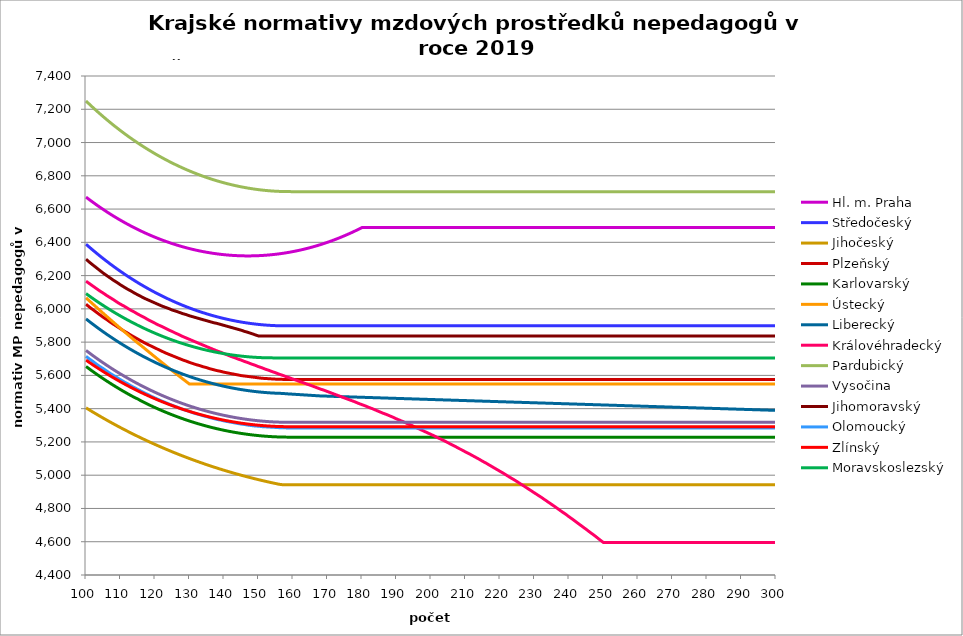
| Category | Hl. m. Praha | Středočeský | Jihočeský | Plzeňský | Karlovarský  | Ústecký   | Liberecký | Královéhradecký | Pardubický | Vysočina | Jihomoravský | Olomoucký | Zlínský | Moravskoslezský |
|---|---|---|---|---|---|---|---|---|---|---|---|---|---|---|
| 100.0 | 6671.932 | 6388.676 | 5404.99 | 6027.965 | 5653.637 | 6066.515 | 5939.588 | 6166.524 | 7249.706 | 5749.935 | 6298.651 | 5714.683 | 5691.974 | 6091.869 |
| 101.0 | 6656.235 | 6370.554 | 5392.238 | 6010.844 | 5638.253 | 6047.606 | 5923.342 | 6151.72 | 7229.979 | 5734.349 | 6280.38 | 5698.536 | 5677.551 | 6076.849 |
| 102.0 | 6640.947 | 6352.846 | 5379.684 | 5995.364 | 5623.214 | 6028.814 | 5907.46 | 6136.988 | 7210.694 | 5718.994 | 6263.861 | 5683.935 | 5663.445 | 6062.179 |
| 103.0 | 6626.064 | 6335.548 | 5367.325 | 5979.964 | 5608.513 | 6010.138 | 5891.937 | 6122.325 | 7191.844 | 5704.014 | 6247.429 | 5667.961 | 5649.653 | 6047.856 |
| 104.0 | 6611.579 | 6318.652 | 5355.159 | 5964.643 | 5594.148 | 5991.578 | 5876.768 | 6107.733 | 7173.422 | 5689.403 | 6231.083 | 5653.517 | 5636.169 | 6033.875 |
| 105.0 | 6597.49 | 6302.154 | 5343.183 | 5949.399 | 5580.112 | 5973.132 | 5861.947 | 6094.82 | 7155.424 | 5675.158 | 6214.823 | 5640.58 | 5622.991 | 6020.232 |
| 106.0 | 6583.789 | 6286.048 | 5331.395 | 5935.747 | 5566.402 | 5954.799 | 5847.471 | 6080.359 | 7137.843 | 5661.272 | 6200.26 | 5626.274 | 5610.114 | 6006.922 |
| 107.0 | 6570.475 | 6270.329 | 5319.793 | 5920.651 | 5553.013 | 5936.579 | 5833.334 | 6067.561 | 7120.675 | 5647.597 | 6185.766 | 5612.041 | 5597.535 | 5993.942 |
| 108.0 | 6557.541 | 6254.99 | 5308.376 | 5907.13 | 5539.941 | 5918.469 | 5819.533 | 6054.818 | 7103.913 | 5634.274 | 6171.34 | 5599.293 | 5585.25 | 5981.288 |
| 109.0 | 6544.984 | 6240.029 | 5297.14 | 5893.671 | 5527.183 | 5900.47 | 5806.062 | 6040.545 | 7087.553 | 5621.299 | 6158.573 | 5586.603 | 5573.255 | 5968.956 |
| 110.0 | 6532.799 | 6225.438 | 5286.085 | 5880.273 | 5514.734 | 5882.58 | 5792.918 | 6027.914 | 7071.589 | 5608.666 | 6144.272 | 5573.97 | 5561.548 | 5956.942 |
| 111.0 | 6520.984 | 6211.215 | 5275.208 | 5866.935 | 5502.59 | 5864.798 | 5780.097 | 6016.906 | 7056.017 | 5596.372 | 6131.617 | 5561.394 | 5550.124 | 5945.242 |
| 112.0 | 6509.534 | 6197.354 | 5264.507 | 5855.131 | 5490.748 | 5847.123 | 5767.596 | 6004.374 | 7040.832 | 5584.272 | 6119.013 | 5550.263 | 5538.981 | 5933.854 |
| 113.0 | 6498.445 | 6183.851 | 5253.98 | 5841.907 | 5479.205 | 5829.555 | 5755.409 | 5991.894 | 7026.03 | 5572.504 | 6108.028 | 5537.793 | 5528.116 | 5922.774 |
| 114.0 | 6487.714 | 6170.701 | 5243.625 | 5830.203 | 5467.956 | 5812.092 | 5743.534 | 5981.017 | 7011.605 | 5561.064 | 6095.521 | 5526.756 | 5517.525 | 5911.999 |
| 115.0 | 6477.338 | 6157.9 | 5233.442 | 5818.545 | 5458.362 | 5794.733 | 5731.966 | 5968.634 | 6997.555 | 5549.948 | 6084.619 | 5515.763 | 5507.206 | 5901.526 |
| 116.0 | 6467.313 | 6145.446 | 5223.427 | 5806.934 | 5446.33 | 5779.041 | 5720.704 | 5957.84 | 6983.874 | 5539.152 | 6073.757 | 5504.814 | 5497.156 | 5891.352 |
| 117.0 | 6457.637 | 6133.332 | 5213.579 | 5795.37 | 5435.946 | 5761.879 | 5709.742 | 5947.086 | 6970.559 | 5528.536 | 6062.933 | 5493.908 | 5487.371 | 5881.473 |
| 118.0 | 6448.306 | 6121.557 | 5203.897 | 5785.288 | 5425.844 | 5744.818 | 5699.079 | 5934.843 | 6957.605 | 5518.235 | 6053.686 | 5484.4 | 5477.851 | 5871.887 |
| 119.0 | 6439.318 | 6110.116 | 5194.379 | 5775.242 | 5416.022 | 5727.858 | 5688.71 | 5924.172 | 6945.01 | 5508.246 | 6044.467 | 5473.575 | 5468.591 | 5862.592 |
| 120.0 | 6430.669 | 6099.005 | 5185.024 | 5765.23 | 5406.476 | 5710.998 | 5678.634 | 5913.538 | 6932.769 | 5498.564 | 6035.276 | 5464.138 | 5459.589 | 5853.584 |
| 121.0 | 6422.357 | 6088.222 | 5175.829 | 5755.253 | 5397.204 | 5694.237 | 5668.846 | 5902.943 | 6920.879 | 5489.188 | 6026.113 | 5454.733 | 5450.844 | 5844.862 |
| 122.0 | 6414.38 | 6077.763 | 5166.793 | 5745.311 | 5388.202 | 5677.574 | 5659.345 | 5893.892 | 6909.337 | 5479.979 | 6016.978 | 5445.361 | 5442.352 | 5836.422 |
| 123.0 | 6406.735 | 6067.625 | 5157.915 | 5735.403 | 5379.469 | 5661.008 | 5650.127 | 5883.367 | 6898.138 | 5471.071 | 6009.387 | 5437.353 | 5434.112 | 5828.263 |
| 124.0 | 6399.42 | 6057.805 | 5149.193 | 5726.937 | 5371.002 | 5644.538 | 5641.19 | 5872.88 | 6887.281 | 5462.46 | 6001.815 | 5428.04 | 5426.121 | 5820.382 |
| 125.0 | 6392.432 | 6048.3 | 5140.626 | 5718.497 | 5362.799 | 5628.165 | 5632.532 | 5863.921 | 6876.762 | 5454.144 | 5992.753 | 5420.083 | 5418.378 | 5812.777 |
| 126.0 | 6385.771 | 6039.107 | 5132.212 | 5710.081 | 5354.857 | 5611.885 | 5624.15 | 5853.503 | 6866.578 | 5446.12 | 5986.727 | 5412.149 | 5410.879 | 5805.447 |
| 127.0 | 6379.432 | 6030.223 | 5123.951 | 5701.69 | 5347.175 | 5595.7 | 5616.041 | 5844.602 | 6856.727 | 5438.253 | 5979.212 | 5404.239 | 5403.624 | 5798.388 |
| 128.0 | 6373.416 | 6021.647 | 5115.84 | 5693.324 | 5339.749 | 5579.608 | 5608.203 | 5834.252 | 6847.204 | 5430.674 | 5971.715 | 5396.351 | 5396.611 | 5791.599 |
| 129.0 | 6367.719 | 6013.375 | 5107.878 | 5686.37 | 5332.578 | 5563.608 | 5600.635 | 5825.41 | 6838.009 | 5423.381 | 5965.731 | 5389.796 | 5389.837 | 5785.078 |
| 130.0 | 6362.34 | 6005.404 | 5100.065 | 5678.049 | 5325.66 | 5547.7 | 5593.334 | 5816.595 | 6829.138 | 5416.372 | 5958.269 | 5383.256 | 5383.3 | 5778.824 |
| 131.0 | 6357.278 | 5997.734 | 5092.399 | 5671.133 | 5318.993 | 5547.7 | 5586.298 | 5807.807 | 6820.59 | 5409.644 | 5952.312 | 5375.43 | 5377 | 5772.835 |
| 132.0 | 6352.532 | 5990.361 | 5084.878 | 5664.234 | 5312.576 | 5547.7 | 5579.525 | 5799.045 | 6812.361 | 5403.065 | 5946.367 | 5368.925 | 5370.935 | 5767.108 |
| 133.0 | 6348.099 | 5983.283 | 5077.502 | 5658.726 | 5306.406 | 5547.7 | 5573.013 | 5790.309 | 6804.449 | 5396.764 | 5940.434 | 5363.733 | 5365.102 | 5761.644 |
| 134.0 | 6343.978 | 5976.499 | 5070.269 | 5651.857 | 5300.482 | 5547.7 | 5566.761 | 5781.599 | 6796.852 | 5390.739 | 5934.513 | 5357.257 | 5359.501 | 5756.439 |
| 135.0 | 6340.169 | 5970.005 | 5063.179 | 5646.374 | 5294.802 | 5547.7 | 5560.767 | 5772.916 | 6789.569 | 5384.988 | 5928.603 | 5352.087 | 5354.131 | 5751.494 |
| 136.0 | 6336.67 | 5963.802 | 5056.229 | 5639.535 | 5289.365 | 5547.7 | 5555.029 | 5764.259 | 6782.597 | 5379.511 | 5922.706 | 5345.639 | 5348.989 | 5746.806 |
| 137.0 | 6333.48 | 5957.886 | 5049.42 | 5634.076 | 5284.169 | 5547.7 | 5549.546 | 5755.628 | 6775.934 | 5374.174 | 5916.82 | 5340.491 | 5344.075 | 5742.374 |
| 138.0 | 6330.598 | 5952.256 | 5042.749 | 5628.627 | 5279.213 | 5547.7 | 5544.316 | 5747.022 | 6769.579 | 5369.108 | 5912.413 | 5335.354 | 5339.387 | 5738.197 |
| 139.0 | 6328.023 | 5946.911 | 5036.217 | 5624.547 | 5274.496 | 5547.7 | 5539.337 | 5739.871 | 6763.53 | 5364.31 | 5906.548 | 5331.507 | 5334.924 | 5734.275 |
| 140.0 | 6325.756 | 5941.849 | 5029.821 | 5619.117 | 5270.016 | 5547.7 | 5534.609 | 5731.312 | 6757.785 | 5359.78 | 5900.694 | 5326.387 | 5330.685 | 5730.605 |
| 141.0 | 6323.794 | 5937.068 | 5023.561 | 5615.051 | 5265.772 | 5547.7 | 5530.131 | 5722.779 | 6752.343 | 5355.515 | 5894.851 | 5322.553 | 5326.669 | 5727.187 |
| 142.0 | 6322.137 | 5932.567 | 5017.437 | 5610.991 | 5261.763 | 5547.7 | 5525.9 | 5714.272 | 6747.203 | 5351.387 | 5889.021 | 5318.725 | 5322.875 | 5724.021 |
| 143.0 | 6320.785 | 5928.346 | 5011.446 | 5606.936 | 5257.988 | 5547.7 | 5521.917 | 5707.201 | 6742.362 | 5347.521 | 5883.202 | 5314.902 | 5319.302 | 5721.104 |
| 144.0 | 6319.738 | 5924.402 | 5005.589 | 5602.888 | 5254.446 | 5547.7 | 5518.179 | 5698.74 | 6737.82 | 5343.919 | 5877.394 | 5311.085 | 5315.95 | 5718.438 |
| 145.0 | 6318.995 | 5920.735 | 4999.864 | 5598.846 | 5251.136 | 5547.7 | 5514.686 | 5691.708 | 6733.576 | 5340.578 | 5871.598 | 5307.273 | 5312.816 | 5716.02 |
| 146.0 | 6318.557 | 5917.344 | 4994.27 | 5596.154 | 5248.057 | 5547.7 | 5511.437 | 5683.292 | 6729.628 | 5337.498 | 5864.368 | 5304.735 | 5309.902 | 5713.85 |
| 147.0 | 6318.422 | 5914.227 | 4988.807 | 5593.465 | 5245.209 | 5547.7 | 5508.431 | 5676.298 | 6725.975 | 5334.55 | 5858.598 | 5300.932 | 5307.205 | 5711.928 |
| 148.0 | 6318.59 | 5911.384 | 4983.473 | 5590.778 | 5242.59 | 5547.7 | 5505.667 | 5667.928 | 6722.617 | 5331.861 | 5851.4 | 5298.4 | 5304.725 | 5710.253 |
| 149.0 | 6319.063 | 5908.815 | 4978.269 | 5588.094 | 5240.2 | 5547.7 | 5503.145 | 5660.972 | 6719.552 | 5329.43 | 5844.221 | 5295.87 | 5302.462 | 5708.825 |
| 150.0 | 6319.84 | 5906.517 | 4973.193 | 5585.413 | 5238.038 | 5547.7 | 5500.864 | 5652.647 | 6716.78 | 5327.257 | 5837.059 | 5294.606 | 5300.415 | 5707.643 |
| 151.0 | 6320.921 | 5904.492 | 4968.244 | 5582.734 | 5236.104 | 5547.7 | 5498.823 | 5645.728 | 6714.3 | 5325.342 | 5837.059 | 5292.08 | 5298.584 | 5706.707 |
| 152.0 | 6322.306 | 5902.737 | 4963.422 | 5581.395 | 5234.397 | 5547.7 | 5497.022 | 5637.448 | 6712.112 | 5323.555 | 5837.059 | 5290.818 | 5296.968 | 5706.017 |
| 153.0 | 6323.997 | 5901.254 | 4958.726 | 5580.058 | 5232.918 | 5547.7 | 5495.461 | 5630.566 | 6710.214 | 5322.024 | 5837.059 | 5289.557 | 5295.566 | 5705.573 |
| 154.0 | 6325.992 | 5900.04 | 4954.155 | 5578.72 | 5231.664 | 5547.7 | 5494.138 | 5622.331 | 6708.606 | 5320.749 | 5837.059 | 5288.296 | 5294.379 | 5705.374 |
| 155.0 | 6328.294 | 5899.097 | 4949.709 | 5577.384 | 5230.637 | 5547.7 | 5493.054 | 5615.486 | 6707.289 | 5319.73 | 5837.059 | 5287.035 | 5293.406 | 5704.821 |
| 156.0 | 6330.903 | 5898.423 | 4945.387 | 5577.384 | 5229.835 | 5547.7 | 5492.208 | 5607.294 | 6706.261 | 5318.966 | 5837.059 | 5285.776 | 5292.646 | 5704.821 |
| 157.0 | 6333.819 | 5898.019 | 4942.671 | 5576.048 | 5229.259 | 5547.7 | 5491.6 | 5600.486 | 6705.522 | 5318.329 | 5837.059 | 5285.776 | 5292.101 | 5704.821 |
| 158.0 | 6337.043 | 5897.885 | 4942.671 | 5576.048 | 5228.908 | 5547.7 | 5489.619 | 5592.338 | 6705.073 | 5317.947 | 5837.059 | 5284.516 | 5291.769 | 5704.821 |
| 159.0 | 6340.577 | 5898.019 | 4942.671 | 5576.048 | 5228.783 | 5547.7 | 5488.299 | 5585.566 | 6704.912 | 5317.819 | 5837.059 | 5284.516 | 5291.65 | 5704.821 |
| 160.0 | 6344.421 | 5897.885 | 4942.671 | 5576.048 | 5228.883 | 5547.7 | 5486.98 | 5577.461 | 6704.72 | 5317.692 | 5837.059 | 5284.516 | 5291.65 | 5704.821 |
| 161.0 | 6348.576 | 5897.885 | 4942.671 | 5576.048 | 5228.633 | 5547.7 | 5485.661 | 5570.725 | 6704.72 | 5317.692 | 5837.059 | 5284.516 | 5291.65 | 5704.821 |
| 162.0 | 6353.044 | 5897.885 | 4942.671 | 5576.048 | 5228.633 | 5547.7 | 5484.343 | 5562.663 | 6704.72 | 5317.692 | 5837.059 | 5284.516 | 5291.65 | 5704.821 |
| 163.0 | 6357.825 | 5897.885 | 4942.671 | 5576.048 | 5228.633 | 5547.7 | 5483.026 | 5555.962 | 6704.72 | 5317.692 | 5837.059 | 5284.516 | 5291.65 | 5704.821 |
| 164.0 | 6362.922 | 5897.885 | 4942.671 | 5576.048 | 5228.633 | 5547.7 | 5481.709 | 5547.943 | 6704.72 | 5317.692 | 5837.059 | 5284.516 | 5291.65 | 5704.821 |
| 165.0 | 6368.336 | 5897.885 | 4942.671 | 5576.048 | 5228.633 | 5547.7 | 5480.393 | 5541.278 | 6704.72 | 5317.692 | 5837.059 | 5284.516 | 5291.65 | 5704.821 |
| 166.0 | 6374.068 | 5897.885 | 4942.671 | 5576.048 | 5228.633 | 5547.7 | 5479.077 | 5533.301 | 6704.72 | 5317.692 | 5837.059 | 5284.516 | 5291.65 | 5704.821 |
| 167.0 | 6380.121 | 5897.885 | 4942.671 | 5576.048 | 5228.633 | 5547.7 | 5477.762 | 5525.347 | 6704.72 | 5317.692 | 5837.059 | 5284.516 | 5291.65 | 5704.821 |
| 168.0 | 6386.495 | 5897.885 | 4942.671 | 5576.048 | 5228.633 | 5547.7 | 5476.448 | 5517.416 | 6704.72 | 5317.692 | 5837.059 | 5284.516 | 5291.65 | 5704.821 |
| 169.0 | 6393.193 | 5897.885 | 4942.671 | 5576.048 | 5228.633 | 5547.7 | 5476.448 | 5510.824 | 6704.72 | 5317.692 | 5837.059 | 5284.516 | 5291.65 | 5704.821 |
| 170.0 | 6400.216 | 5897.885 | 4942.671 | 5576.048 | 5228.633 | 5547.7 | 5475.135 | 5502.935 | 6704.72 | 5317.692 | 5837.059 | 5284.516 | 5291.65 | 5704.821 |
| 171.0 | 6407.568 | 5897.885 | 4942.671 | 5576.048 | 5228.633 | 5547.7 | 5474.421 | 5495.068 | 6704.72 | 5317.692 | 5837.059 | 5284.516 | 5291.65 | 5704.821 |
| 172.0 | 6415.25 | 5897.885 | 4942.671 | 5576.048 | 5228.633 | 5547.7 | 5473.755 | 5487.223 | 6704.72 | 5317.692 | 5837.059 | 5284.516 | 5291.65 | 5704.821 |
| 173.0 | 6423.264 | 5897.885 | 4942.671 | 5576.048 | 5228.633 | 5547.7 | 5473.089 | 5479.401 | 6704.72 | 5317.692 | 5837.059 | 5284.516 | 5291.65 | 5704.821 |
| 174.0 | 6431.613 | 5897.885 | 4942.671 | 5576.048 | 5228.633 | 5547.7 | 5472.423 | 5471.601 | 6704.72 | 5317.692 | 5837.059 | 5284.516 | 5291.65 | 5704.821 |
| 175.0 | 6440.3 | 5897.885 | 4942.671 | 5576.048 | 5228.633 | 5547.7 | 5471.757 | 5463.824 | 6704.72 | 5317.692 | 5837.059 | 5284.516 | 5291.65 | 5704.821 |
| 176.0 | 6449.326 | 5897.885 | 4942.671 | 5576.048 | 5228.633 | 5547.7 | 5471.091 | 5456.068 | 6704.72 | 5317.692 | 5837.059 | 5284.516 | 5291.65 | 5704.821 |
| 177.0 | 6458.695 | 5897.885 | 4942.671 | 5576.048 | 5228.633 | 5547.7 | 5470.425 | 5448.335 | 6704.72 | 5317.692 | 5837.059 | 5284.516 | 5291.65 | 5704.821 |
| 178.0 | 6468.41 | 5897.885 | 4942.671 | 5576.048 | 5228.633 | 5547.7 | 5469.76 | 5440.623 | 6704.72 | 5317.692 | 5837.059 | 5284.516 | 5291.65 | 5704.821 |
| 179.0 | 6478.474 | 5897.885 | 4942.671 | 5576.048 | 5228.633 | 5547.7 | 5469.095 | 5431.653 | 6704.72 | 5317.692 | 5837.059 | 5284.516 | 5291.65 | 5704.821 |
| 180.0 | 6488.889 | 5897.885 | 4942.671 | 5576.048 | 5228.633 | 5547.7 | 5468.43 | 5423.989 | 6704.72 | 5317.692 | 5837.059 | 5284.516 | 5291.65 | 5704.821 |
| 181.0 | 6488.889 | 5897.885 | 4942.671 | 5576.048 | 5228.633 | 5547.7 | 5467.765 | 5416.346 | 6704.72 | 5317.692 | 5837.059 | 5284.516 | 5291.65 | 5704.821 |
| 182.0 | 6488.889 | 5897.885 | 4942.671 | 5576.048 | 5228.633 | 5547.7 | 5467.1 | 5407.456 | 6704.72 | 5317.692 | 5837.059 | 5284.516 | 5291.65 | 5704.821 |
| 183.0 | 6488.889 | 5897.885 | 4942.671 | 5576.048 | 5228.633 | 5547.7 | 5466.435 | 5399.86 | 6704.72 | 5317.692 | 5837.059 | 5284.516 | 5291.65 | 5704.821 |
| 184.0 | 6488.889 | 5897.885 | 4942.671 | 5576.048 | 5228.633 | 5547.7 | 5465.771 | 5391.024 | 6704.72 | 5317.692 | 5837.059 | 5284.516 | 5291.65 | 5704.821 |
| 185.0 | 6488.889 | 5897.885 | 4942.671 | 5576.048 | 5228.633 | 5547.7 | 5465.107 | 5382.217 | 6704.72 | 5317.692 | 5837.059 | 5284.516 | 5291.65 | 5704.821 |
| 186.0 | 6488.889 | 5897.885 | 4942.671 | 5576.048 | 5228.633 | 5547.7 | 5464.443 | 5373.439 | 6704.72 | 5317.692 | 5837.059 | 5284.516 | 5291.65 | 5704.821 |
| 187.0 | 6488.889 | 5897.885 | 4942.671 | 5576.048 | 5228.633 | 5547.7 | 5463.779 | 5365.938 | 6704.72 | 5317.692 | 5837.059 | 5284.516 | 5291.65 | 5704.821 |
| 188.0 | 6488.889 | 5897.885 | 4942.671 | 5576.048 | 5228.633 | 5547.7 | 5463.115 | 5357.213 | 6704.72 | 5317.692 | 5837.059 | 5284.516 | 5291.65 | 5704.821 |
| 189.0 | 6488.889 | 5897.885 | 4942.671 | 5576.048 | 5228.633 | 5547.7 | 5462.451 | 5348.516 | 6704.72 | 5317.692 | 5837.059 | 5284.516 | 5291.65 | 5704.821 |
| 190.0 | 6488.889 | 5897.885 | 4942.671 | 5576.048 | 5228.633 | 5547.7 | 5461.788 | 5338.611 | 6704.72 | 5317.692 | 5837.059 | 5284.516 | 5291.65 | 5704.821 |
| 191.0 | 6488.889 | 5897.885 | 4942.671 | 5576.048 | 5228.633 | 5547.7 | 5461.124 | 5329.975 | 6704.72 | 5317.692 | 5837.059 | 5284.516 | 5291.65 | 5704.821 |
| 192.0 | 6488.889 | 5897.885 | 4942.671 | 5576.048 | 5228.633 | 5547.7 | 5460.461 | 5321.366 | 6704.72 | 5317.692 | 5837.059 | 5284.516 | 5291.65 | 5704.821 |
| 193.0 | 6488.889 | 5897.885 | 4942.671 | 5576.048 | 5228.633 | 5547.7 | 5459.798 | 5311.561 | 6704.72 | 5317.692 | 5837.059 | 5284.516 | 5291.65 | 5704.821 |
| 194.0 | 6488.889 | 5897.885 | 4942.671 | 5576.048 | 5228.633 | 5547.7 | 5459.135 | 5303.012 | 6704.72 | 5317.692 | 5837.059 | 5284.516 | 5291.65 | 5704.821 |
| 195.0 | 6488.889 | 5897.885 | 4942.671 | 5576.048 | 5228.633 | 5547.7 | 5458.473 | 5293.275 | 6704.72 | 5317.692 | 5837.059 | 5284.516 | 5291.65 | 5704.821 |
| 196.0 | 6488.889 | 5897.885 | 4942.671 | 5576.048 | 5228.633 | 5547.7 | 5457.81 | 5283.574 | 6704.72 | 5317.692 | 5837.059 | 5284.516 | 5291.65 | 5704.821 |
| 197.0 | 6488.889 | 5897.885 | 4942.671 | 5576.048 | 5228.633 | 5547.7 | 5457.148 | 5273.908 | 6704.72 | 5317.692 | 5837.059 | 5284.516 | 5291.65 | 5704.821 |
| 198.0 | 6488.889 | 5897.885 | 4942.671 | 5576.048 | 5228.633 | 5547.7 | 5456.486 | 5264.278 | 6704.72 | 5317.692 | 5837.059 | 5284.516 | 5291.65 | 5704.821 |
| 199.0 | 6488.889 | 5897.885 | 4942.671 | 5576.048 | 5228.633 | 5547.7 | 5455.824 | 5254.682 | 6704.72 | 5317.692 | 5837.059 | 5284.516 | 5291.65 | 5704.821 |
| 200.0 | 6488.889 | 5897.885 | 4942.671 | 5576.048 | 5228.633 | 5547.7 | 5455.162 | 5245.122 | 6704.72 | 5317.692 | 5837.059 | 5284.516 | 5291.65 | 5704.821 |
| 201.0 | 6488.889 | 5897.885 | 4942.671 | 5576.048 | 5228.633 | 5547.7 | 5454.5 | 5235.596 | 6704.72 | 5317.692 | 5837.059 | 5284.516 | 5291.65 | 5704.821 |
| 202.0 | 6488.889 | 5897.885 | 4942.671 | 5576.048 | 5228.633 | 5547.7 | 5453.838 | 5224.921 | 6704.72 | 5317.692 | 5837.059 | 5284.516 | 5291.65 | 5704.821 |
| 203.0 | 6488.889 | 5897.885 | 4942.671 | 5576.048 | 5228.633 | 5547.7 | 5453.177 | 5215.468 | 6704.72 | 5317.692 | 5837.059 | 5284.516 | 5291.65 | 5704.821 |
| 204.0 | 6488.889 | 5897.885 | 4942.671 | 5576.048 | 5228.633 | 5547.7 | 5452.516 | 5204.875 | 6704.72 | 5317.692 | 5837.059 | 5284.516 | 5291.65 | 5704.821 |
| 205.0 | 6488.889 | 5897.885 | 4942.671 | 5576.048 | 5228.633 | 5547.7 | 5451.855 | 5194.324 | 6704.72 | 5317.692 | 5837.059 | 5284.516 | 5291.65 | 5704.821 |
| 206.0 | 6488.889 | 5897.885 | 4942.671 | 5576.048 | 5228.633 | 5547.7 | 5451.194 | 5183.817 | 6704.72 | 5317.692 | 5837.059 | 5284.516 | 5291.65 | 5704.821 |
| 207.0 | 6488.889 | 5897.885 | 4942.671 | 5576.048 | 5228.633 | 5547.7 | 5450.533 | 5173.351 | 6704.72 | 5317.692 | 5837.059 | 5284.516 | 5291.65 | 5704.821 |
| 208.0 | 6488.889 | 5897.885 | 4942.671 | 5576.048 | 5228.633 | 5547.7 | 5449.872 | 5161.773 | 6704.72 | 5317.692 | 5837.059 | 5284.516 | 5291.65 | 5704.821 |
| 209.0 | 6488.889 | 5897.885 | 4942.671 | 5576.048 | 5228.633 | 5547.7 | 5449.212 | 5151.396 | 6704.72 | 5317.692 | 5837.059 | 5284.516 | 5291.65 | 5704.821 |
| 210.0 | 6488.889 | 5897.885 | 4942.671 | 5576.048 | 5228.633 | 5547.7 | 5448.552 | 5139.915 | 6704.72 | 5317.692 | 5837.059 | 5284.516 | 5291.65 | 5704.821 |
| 211.0 | 6488.889 | 5897.885 | 4942.671 | 5576.048 | 5228.633 | 5547.7 | 5447.892 | 5129.626 | 6704.72 | 5317.692 | 5837.059 | 5284.516 | 5291.65 | 5704.821 |
| 212.0 | 6488.889 | 5897.885 | 4942.671 | 5576.048 | 5228.633 | 5547.7 | 5447.232 | 5118.242 | 6704.72 | 5317.692 | 5837.059 | 5284.516 | 5291.65 | 5704.821 |
| 213.0 | 6488.889 | 5897.885 | 4942.671 | 5576.048 | 5228.633 | 5547.7 | 5446.572 | 5106.909 | 6704.72 | 5317.692 | 5837.059 | 5284.516 | 5291.65 | 5704.821 |
| 214.0 | 6488.889 | 5897.885 | 4942.671 | 5576.048 | 5228.633 | 5547.7 | 5445.912 | 5095.625 | 6704.72 | 5317.692 | 5837.059 | 5284.516 | 5291.65 | 5704.821 |
| 215.0 | 6488.889 | 5897.885 | 4942.671 | 5576.048 | 5228.633 | 5547.7 | 5445.253 | 5083.271 | 6704.72 | 5317.692 | 5837.059 | 5284.516 | 5291.65 | 5704.821 |
| 216.0 | 6488.889 | 5897.885 | 4942.671 | 5576.048 | 5228.633 | 5547.7 | 5444.593 | 5072.091 | 6704.72 | 5317.692 | 5837.059 | 5284.516 | 5291.65 | 5704.821 |
| 217.0 | 6488.889 | 5897.885 | 4942.671 | 5576.048 | 5228.633 | 5547.7 | 5443.934 | 5059.851 | 6704.72 | 5317.692 | 5837.059 | 5284.516 | 5291.65 | 5704.821 |
| 218.0 | 6488.889 | 5897.885 | 4942.671 | 5576.048 | 5228.633 | 5547.7 | 5443.275 | 5047.669 | 6704.72 | 5317.692 | 5837.059 | 5284.516 | 5291.65 | 5704.821 |
| 219.0 | 6488.889 | 5897.885 | 4942.671 | 5576.048 | 5228.633 | 5547.7 | 5442.616 | 5035.546 | 6704.72 | 5317.692 | 5837.059 | 5284.516 | 5291.65 | 5704.821 |
| 220.0 | 6488.889 | 5897.885 | 4942.671 | 5576.048 | 5228.633 | 5547.7 | 5441.958 | 5023.481 | 6704.72 | 5317.692 | 5837.059 | 5284.516 | 5291.65 | 5704.821 |
| 221.0 | 6488.889 | 5897.885 | 4942.671 | 5576.048 | 5228.633 | 5547.7 | 5441.299 | 5011.473 | 6704.72 | 5317.692 | 5837.059 | 5284.516 | 5291.65 | 5704.821 |
| 222.0 | 6488.889 | 5897.885 | 4942.671 | 5576.048 | 5228.633 | 5547.7 | 5440.641 | 4998.44 | 6704.72 | 5317.692 | 5837.059 | 5284.516 | 5291.65 | 5704.821 |
| 223.0 | 6488.889 | 5897.885 | 4942.671 | 5576.048 | 5228.633 | 5547.7 | 5439.983 | 4985.473 | 6704.72 | 5317.692 | 5837.059 | 5284.516 | 5291.65 | 5704.821 |
| 224.0 | 6488.889 | 5897.885 | 4942.671 | 5576.048 | 5228.633 | 5547.7 | 5439.325 | 4973.647 | 6704.72 | 5317.692 | 5837.059 | 5284.516 | 5291.65 | 5704.821 |
| 225.0 | 6488.889 | 5897.885 | 4942.671 | 5576.048 | 5228.633 | 5547.7 | 5438.667 | 4960.809 | 6704.72 | 5317.692 | 5837.059 | 5284.516 | 5291.65 | 5704.821 |
| 226.0 | 6488.889 | 5897.885 | 4942.671 | 5576.048 | 5228.633 | 5547.7 | 5438.009 | 4946.976 | 6704.72 | 5317.692 | 5837.059 | 5284.516 | 5291.65 | 5704.821 |
| 227.0 | 6488.889 | 5897.885 | 4942.671 | 5576.048 | 5228.633 | 5547.7 | 5437.352 | 4934.275 | 6704.72 | 5317.692 | 5837.059 | 5284.516 | 5291.65 | 5704.821 |
| 228.0 | 6488.889 | 5897.885 | 4942.671 | 5576.048 | 5228.633 | 5547.7 | 5436.694 | 4920.589 | 6704.72 | 5317.692 | 5837.059 | 5284.516 | 5291.65 | 5704.821 |
| 229.0 | 6488.889 | 5897.885 | 4942.671 | 5576.048 | 5228.633 | 5547.7 | 5436.037 | 4906.979 | 6704.72 | 5317.692 | 5837.059 | 5284.516 | 5291.65 | 5704.821 |
| 230.0 | 6488.889 | 5897.885 | 4942.671 | 5576.048 | 5228.633 | 5547.7 | 5435.38 | 4893.444 | 6704.72 | 5317.692 | 5837.059 | 5284.516 | 5291.65 | 5704.821 |
| 231.0 | 6488.889 | 5897.885 | 4942.671 | 5576.048 | 5228.633 | 5547.7 | 5434.723 | 4879.983 | 6704.72 | 5317.692 | 5837.059 | 5284.516 | 5291.65 | 5704.821 |
| 232.0 | 6488.889 | 5897.885 | 4942.671 | 5576.048 | 5228.633 | 5547.7 | 5434.066 | 4866.596 | 6704.72 | 5317.692 | 5837.059 | 5284.516 | 5291.65 | 5704.821 |
| 233.0 | 6488.889 | 5897.885 | 4942.671 | 5576.048 | 5228.633 | 5547.7 | 5433.41 | 4852.262 | 6704.72 | 5317.692 | 5837.059 | 5284.516 | 5291.65 | 5704.821 |
| 234.0 | 6488.889 | 5897.885 | 4942.671 | 5576.048 | 5228.633 | 5547.7 | 5432.753 | 4838.011 | 6704.72 | 5317.692 | 5837.059 | 5284.516 | 5291.65 | 5704.821 |
| 235.0 | 6488.889 | 5897.885 | 4942.671 | 5576.048 | 5228.633 | 5547.7 | 5432.097 | 4823.844 | 6704.72 | 5317.692 | 5837.059 | 5284.516 | 5291.65 | 5704.821 |
| 236.0 | 6488.889 | 5897.885 | 4942.671 | 5576.048 | 5228.633 | 5547.7 | 5431.441 | 4809.76 | 6704.72 | 5317.692 | 5837.059 | 5284.516 | 5291.65 | 5704.821 |
| 237.0 | 6488.889 | 5897.885 | 4942.671 | 5576.048 | 5228.633 | 5547.7 | 5430.785 | 4794.761 | 6704.72 | 5317.692 | 5837.059 | 5284.516 | 5291.65 | 5704.821 |
| 238.0 | 6488.889 | 5897.885 | 4942.671 | 5576.048 | 5228.633 | 5547.7 | 5430.129 | 4779.855 | 6704.72 | 5317.692 | 5837.059 | 5284.516 | 5291.65 | 5704.821 |
| 239.0 | 6488.889 | 5897.885 | 4942.671 | 5576.048 | 5228.633 | 5547.7 | 5429.473 | 4766.026 | 6704.72 | 5317.692 | 5837.059 | 5284.516 | 5291.65 | 5704.821 |
| 240.0 | 6488.889 | 5897.885 | 4942.671 | 5576.048 | 5228.633 | 5547.7 | 5428.818 | 4750.319 | 6704.72 | 5317.692 | 5837.059 | 5284.516 | 5291.65 | 5704.821 |
| 241.0 | 6488.889 | 5897.885 | 4942.671 | 5576.048 | 5228.633 | 5547.7 | 5428.162 | 4735.688 | 6704.72 | 5317.692 | 5837.059 | 5284.516 | 5291.65 | 5704.821 |
| 242.0 | 6488.889 | 5897.885 | 4942.671 | 5576.048 | 5228.633 | 5547.7 | 5427.507 | 4720.18 | 6704.72 | 5317.692 | 5837.059 | 5284.516 | 5291.65 | 5704.821 |
| 243.0 | 6488.889 | 5897.885 | 4942.671 | 5576.048 | 5228.633 | 5547.7 | 5426.852 | 4704.774 | 6704.72 | 5317.692 | 5837.059 | 5284.516 | 5291.65 | 5704.821 |
| 244.0 | 6488.889 | 5897.885 | 4942.671 | 5576.048 | 5228.633 | 5547.7 | 5426.197 | 4689.467 | 6704.72 | 5317.692 | 5837.059 | 5284.516 | 5291.65 | 5704.821 |
| 245.0 | 6488.889 | 5897.885 | 4942.671 | 5576.048 | 5228.633 | 5547.7 | 5425.543 | 4674.26 | 6704.72 | 5317.692 | 5837.059 | 5284.516 | 5291.65 | 5704.821 |
| 246.0 | 6488.889 | 5897.885 | 4942.671 | 5576.048 | 5228.633 | 5547.7 | 5424.888 | 4658.21 | 6704.72 | 5317.692 | 5837.059 | 5284.516 | 5291.65 | 5704.821 |
| 247.0 | 6488.889 | 5897.885 | 4942.671 | 5576.048 | 5228.633 | 5547.7 | 5424.234 | 4643.205 | 6704.72 | 5317.692 | 5837.059 | 5284.516 | 5291.65 | 5704.821 |
| 248.0 | 6488.889 | 5897.885 | 4942.671 | 5576.048 | 5228.633 | 5547.7 | 5423.579 | 4627.368 | 6704.72 | 5317.692 | 5837.059 | 5284.516 | 5291.65 | 5704.821 |
| 249.0 | 6488.889 | 5897.885 | 4942.671 | 5576.048 | 5228.633 | 5547.7 | 5422.925 | 4610.716 | 6704.72 | 5317.692 | 5837.059 | 5284.516 | 5291.65 | 5704.821 |
| 250.0 | 6488.889 | 5897.885 | 4942.671 | 5576.048 | 5228.633 | 5547.7 | 5422.271 | 4595.099 | 6704.72 | 5317.692 | 5837.059 | 5284.516 | 5291.65 | 5704.821 |
| 251.0 | 6488.889 | 5897.885 | 4942.671 | 5576.048 | 5228.633 | 5547.7 | 5421.618 | 4595.099 | 6704.72 | 5317.692 | 5837.059 | 5284.516 | 5291.65 | 5704.821 |
| 252.0 | 6488.889 | 5897.885 | 4942.671 | 5576.048 | 5228.633 | 5547.7 | 5420.964 | 4595.099 | 6704.72 | 5317.692 | 5837.059 | 5284.516 | 5291.65 | 5704.821 |
| 253.0 | 6488.889 | 5897.885 | 4942.671 | 5576.048 | 5228.633 | 5547.7 | 5420.311 | 4595.099 | 6704.72 | 5317.692 | 5837.059 | 5284.516 | 5291.65 | 5704.821 |
| 254.0 | 6488.889 | 5897.885 | 4942.671 | 5576.048 | 5228.633 | 5547.7 | 5419.657 | 4595.099 | 6704.72 | 5317.692 | 5837.059 | 5284.516 | 5291.65 | 5704.821 |
| 255.0 | 6488.889 | 5897.885 | 4942.671 | 5576.048 | 5228.633 | 5547.7 | 5419.004 | 4595.099 | 6704.72 | 5317.692 | 5837.059 | 5284.516 | 5291.65 | 5704.821 |
| 256.0 | 6488.889 | 5897.885 | 4942.671 | 5576.048 | 5228.633 | 5547.7 | 5418.351 | 4595.099 | 6704.72 | 5317.692 | 5837.059 | 5284.516 | 5291.65 | 5704.821 |
| 257.0 | 6488.889 | 5897.885 | 4942.671 | 5576.048 | 5228.633 | 5547.7 | 5417.698 | 4595.099 | 6704.72 | 5317.692 | 5837.059 | 5284.516 | 5291.65 | 5704.821 |
| 258.0 | 6488.889 | 5897.885 | 4942.671 | 5576.048 | 5228.633 | 5547.7 | 5417.046 | 4595.099 | 6704.72 | 5317.692 | 5837.059 | 5284.516 | 5291.65 | 5704.821 |
| 259.0 | 6488.889 | 5897.885 | 4942.671 | 5576.048 | 5228.633 | 5547.7 | 5416.393 | 4595.099 | 6704.72 | 5317.692 | 5837.059 | 5284.516 | 5291.65 | 5704.821 |
| 260.0 | 6488.889 | 5897.885 | 4942.671 | 5576.048 | 5228.633 | 5547.7 | 5415.741 | 4595.099 | 6704.72 | 5317.692 | 5837.059 | 5284.516 | 5291.65 | 5704.821 |
| 261.0 | 6488.889 | 5897.885 | 4942.671 | 5576.048 | 5228.633 | 5547.7 | 5415.089 | 4595.099 | 6704.72 | 5317.692 | 5837.059 | 5284.516 | 5291.65 | 5704.821 |
| 262.0 | 6488.889 | 5897.885 | 4942.671 | 5576.048 | 5228.633 | 5547.7 | 5414.437 | 4595.099 | 6704.72 | 5317.692 | 5837.059 | 5284.516 | 5291.65 | 5704.821 |
| 263.0 | 6488.889 | 5897.885 | 4942.671 | 5576.048 | 5228.633 | 5547.7 | 5413.785 | 4595.099 | 6704.72 | 5317.692 | 5837.059 | 5284.516 | 5291.65 | 5704.821 |
| 264.0 | 6488.889 | 5897.885 | 4942.671 | 5576.048 | 5228.633 | 5547.7 | 5413.133 | 4595.099 | 6704.72 | 5317.692 | 5837.059 | 5284.516 | 5291.65 | 5704.821 |
| 265.0 | 6488.889 | 5897.885 | 4942.671 | 5576.048 | 5228.633 | 5547.7 | 5412.482 | 4595.099 | 6704.72 | 5317.692 | 5837.059 | 5284.516 | 5291.65 | 5704.821 |
| 266.0 | 6488.889 | 5897.885 | 4942.671 | 5576.048 | 5228.633 | 5547.7 | 5411.83 | 4595.099 | 6704.72 | 5317.692 | 5837.059 | 5284.516 | 5291.65 | 5704.821 |
| 267.0 | 6488.889 | 5897.885 | 4942.671 | 5576.048 | 5228.633 | 5547.7 | 5411.179 | 4595.099 | 6704.72 | 5317.692 | 5837.059 | 5284.516 | 5291.65 | 5704.821 |
| 268.0 | 6488.889 | 5897.885 | 4942.671 | 5576.048 | 5228.633 | 5547.7 | 5410.528 | 4595.099 | 6704.72 | 5317.692 | 5837.059 | 5284.516 | 5291.65 | 5704.821 |
| 269.0 | 6488.889 | 5897.885 | 4942.671 | 5576.048 | 5228.633 | 5547.7 | 5409.877 | 4595.099 | 6704.72 | 5317.692 | 5837.059 | 5284.516 | 5291.65 | 5704.821 |
| 270.0 | 6488.889 | 5897.885 | 4942.671 | 5576.048 | 5228.633 | 5547.7 | 5409.226 | 4595.099 | 6704.72 | 5317.692 | 5837.059 | 5284.516 | 5291.65 | 5704.821 |
| 271.0 | 6488.889 | 5897.885 | 4942.671 | 5576.048 | 5228.633 | 5547.7 | 5408.576 | 4595.099 | 6704.72 | 5317.692 | 5837.059 | 5284.516 | 5291.65 | 5704.821 |
| 272.0 | 6488.889 | 5897.885 | 4942.671 | 5576.048 | 5228.633 | 5547.7 | 5407.925 | 4595.099 | 6704.72 | 5317.692 | 5837.059 | 5284.516 | 5291.65 | 5704.821 |
| 273.0 | 6488.889 | 5897.885 | 4942.671 | 5576.048 | 5228.633 | 5547.7 | 5407.275 | 4595.099 | 6704.72 | 5317.692 | 5837.059 | 5284.516 | 5291.65 | 5704.821 |
| 274.0 | 6488.889 | 5897.885 | 4942.671 | 5576.048 | 5228.633 | 5547.7 | 5406.625 | 4595.099 | 6704.72 | 5317.692 | 5837.059 | 5284.516 | 5291.65 | 5704.821 |
| 275.0 | 6488.889 | 5897.885 | 4942.671 | 5576.048 | 5228.633 | 5547.7 | 5405.975 | 4595.099 | 6704.72 | 5317.692 | 5837.059 | 5284.516 | 5291.65 | 5704.821 |
| 276.0 | 6488.889 | 5897.885 | 4942.671 | 5576.048 | 5228.633 | 5547.7 | 5405.325 | 4595.099 | 6704.72 | 5317.692 | 5837.059 | 5284.516 | 5291.65 | 5704.821 |
| 277.0 | 6488.889 | 5897.885 | 4942.671 | 5576.048 | 5228.633 | 5547.7 | 5404.675 | 4595.099 | 6704.72 | 5317.692 | 5837.059 | 5284.516 | 5291.65 | 5704.821 |
| 278.0 | 6488.889 | 5897.885 | 4942.671 | 5576.048 | 5228.633 | 5547.7 | 5404.026 | 4595.099 | 6704.72 | 5317.692 | 5837.059 | 5284.516 | 5291.65 | 5704.821 |
| 279.0 | 6488.889 | 5897.885 | 4942.671 | 5576.048 | 5228.633 | 5547.7 | 5403.376 | 4595.099 | 6704.72 | 5317.692 | 5837.059 | 5284.516 | 5291.65 | 5704.821 |
| 280.0 | 6488.889 | 5897.885 | 4942.671 | 5576.048 | 5228.633 | 5547.7 | 5402.727 | 4595.099 | 6704.72 | 5317.692 | 5837.059 | 5284.516 | 5291.65 | 5704.821 |
| 281.0 | 6488.889 | 5897.885 | 4942.671 | 5576.048 | 5228.633 | 5547.7 | 5402.078 | 4595.099 | 6704.72 | 5317.692 | 5837.059 | 5284.516 | 5291.65 | 5704.821 |
| 282.0 | 6488.889 | 5897.885 | 4942.671 | 5576.048 | 5228.633 | 5547.7 | 5401.429 | 4595.099 | 6704.72 | 5317.692 | 5837.059 | 5284.516 | 5291.65 | 5704.821 |
| 283.0 | 6488.889 | 5897.885 | 4942.671 | 5576.048 | 5228.633 | 5547.7 | 5400.78 | 4595.099 | 6704.72 | 5317.692 | 5837.059 | 5284.516 | 5291.65 | 5704.821 |
| 284.0 | 6488.889 | 5897.885 | 4942.671 | 5576.048 | 5228.633 | 5547.7 | 5400.132 | 4595.099 | 6704.72 | 5317.692 | 5837.059 | 5284.516 | 5291.65 | 5704.821 |
| 285.0 | 6488.889 | 5897.885 | 4942.671 | 5576.048 | 5228.633 | 5547.7 | 5399.483 | 4595.099 | 6704.72 | 5317.692 | 5837.059 | 5284.516 | 5291.65 | 5704.821 |
| 286.0 | 6488.889 | 5897.885 | 4942.671 | 5576.048 | 5228.633 | 5547.7 | 5398.835 | 4595.099 | 6704.72 | 5317.692 | 5837.059 | 5284.516 | 5291.65 | 5704.821 |
| 287.0 | 6488.889 | 5897.885 | 4942.671 | 5576.048 | 5228.633 | 5547.7 | 5398.187 | 4595.099 | 6704.72 | 5317.692 | 5837.059 | 5284.516 | 5291.65 | 5704.821 |
| 288.0 | 6488.889 | 5897.885 | 4942.671 | 5576.048 | 5228.633 | 5547.7 | 5397.539 | 4595.099 | 6704.72 | 5317.692 | 5837.059 | 5284.516 | 5291.65 | 5704.821 |
| 289.0 | 6488.889 | 5897.885 | 4942.671 | 5576.048 | 5228.633 | 5547.7 | 5396.891 | 4595.099 | 6704.72 | 5317.692 | 5837.059 | 5284.516 | 5291.65 | 5704.821 |
| 290.0 | 6488.889 | 5897.885 | 4942.671 | 5576.048 | 5228.633 | 5547.7 | 5396.244 | 4595.099 | 6704.72 | 5317.692 | 5837.059 | 5284.516 | 5291.65 | 5704.821 |
| 291.0 | 6488.889 | 5897.885 | 4942.671 | 5576.048 | 5228.633 | 5547.7 | 5395.596 | 4595.099 | 6704.72 | 5317.692 | 5837.059 | 5284.516 | 5291.65 | 5704.821 |
| 292.0 | 6488.889 | 5897.885 | 4942.671 | 5576.048 | 5228.633 | 5547.7 | 5394.949 | 4595.099 | 6704.72 | 5317.692 | 5837.059 | 5284.516 | 5291.65 | 5704.821 |
| 293.0 | 6488.889 | 5897.885 | 4942.671 | 5576.048 | 5228.633 | 5547.7 | 5394.302 | 4595.099 | 6704.72 | 5317.692 | 5837.059 | 5284.516 | 5291.65 | 5704.821 |
| 294.0 | 6488.889 | 5897.885 | 4942.671 | 5576.048 | 5228.633 | 5547.7 | 5393.654 | 4595.099 | 6704.72 | 5317.692 | 5837.059 | 5284.516 | 5291.65 | 5704.821 |
| 295.0 | 6488.889 | 5897.885 | 4942.671 | 5576.048 | 5228.633 | 5547.7 | 5393.008 | 4595.099 | 6704.72 | 5317.692 | 5837.059 | 5284.516 | 5291.65 | 5704.821 |
| 296.0 | 6488.889 | 5897.885 | 4942.671 | 5576.048 | 5228.633 | 5547.7 | 5392.361 | 4595.099 | 6704.72 | 5317.692 | 5837.059 | 5284.516 | 5291.65 | 5704.821 |
| 297.0 | 6488.889 | 5897.885 | 4942.671 | 5576.048 | 5228.633 | 5547.7 | 5391.714 | 4595.099 | 6704.72 | 5317.692 | 5837.059 | 5284.516 | 5291.65 | 5704.821 |
| 298.0 | 6488.889 | 5897.885 | 4942.671 | 5576.048 | 5228.633 | 5547.7 | 5391.068 | 4595.099 | 6704.72 | 5317.692 | 5837.059 | 5284.516 | 5291.65 | 5704.821 |
| 299.0 | 6488.889 | 5897.885 | 4942.671 | 5576.048 | 5228.633 | 5547.7 | 5390.422 | 4595.099 | 6704.72 | 5317.692 | 5837.059 | 5284.516 | 5291.65 | 5704.821 |
| 300.0 | 6488.889 | 5897.885 | 4942.671 | 5576.048 | 5228.633 | 5547.7 | 5389.776 | 4595.099 | 6704.72 | 5317.692 | 5837.059 | 5284.516 | 5291.65 | 5704.821 |